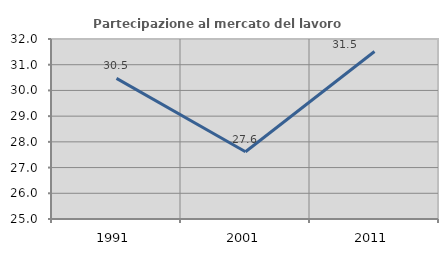
| Category | Partecipazione al mercato del lavoro  femminile |
|---|---|
| 1991.0 | 30.47 |
| 2001.0 | 27.615 |
| 2011.0 | 31.514 |